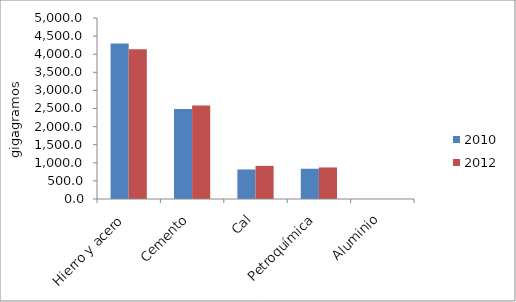
| Category | 2010 | 2012 |
|---|---|---|
| Hierro y acero | 4296.4 | 4138.92 |
| Cemento | 2483.59 | 2586.28 |
| Cal | 815.6 | 915.3 |
| Petroquímica | 835.6 | 871.61 |
| Aluminio | 0 | 0 |